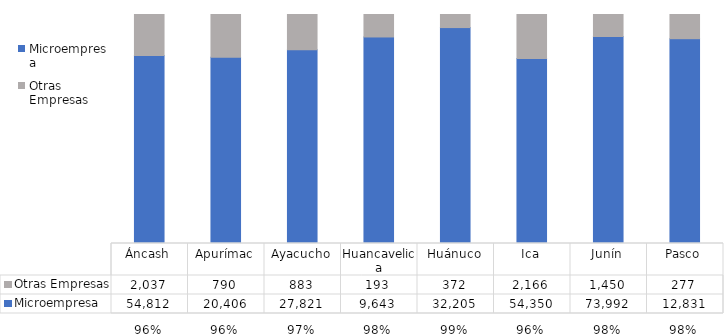
| Category | Microempresa | Otras Empresas |
|---|---|---|
| Áncash | 54812 | 2037 |
| Apurímac | 20406 | 790 |
| Ayacucho | 27821 | 883 |
| Huancavelica | 9643 | 193 |
| Huánuco | 32205 | 372 |
| Ica | 54350 | 2166 |
| Junín | 73992 | 1450 |
| Pasco | 12831 | 277 |